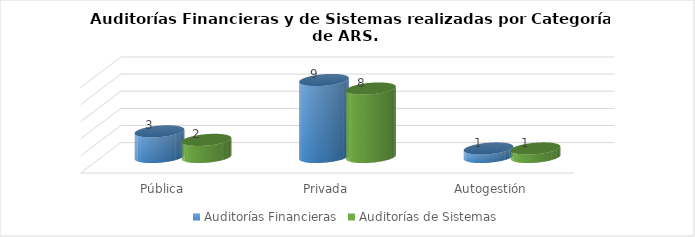
| Category | Auditorías Financieras | Auditorías de Sistemas |
|---|---|---|
| Pública | 3 | 2 |
| Privada | 9 | 8 |
| Autogestión | 1 | 1 |